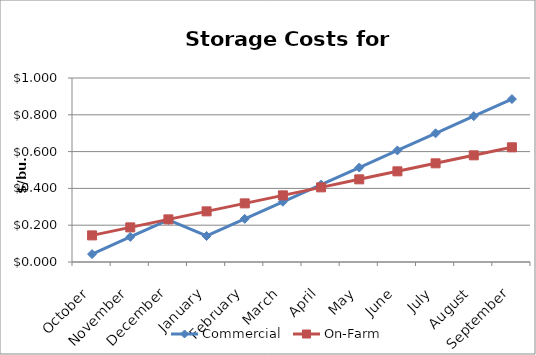
| Category | Commercial | On-Farm |
|---|---|---|
| October | 0.043 | 0.145 |
| November | 0.136 | 0.188 |
| December | 0.229 | 0.232 |
| January | 0.141 | 0.275 |
| February | 0.234 | 0.319 |
| March | 0.327 | 0.362 |
| April | 0.42 | 0.406 |
| May | 0.513 | 0.449 |
| June | 0.606 | 0.493 |
| July | 0.699 | 0.536 |
| August | 0.792 | 0.58 |
| September | 0.885 | 0.623 |